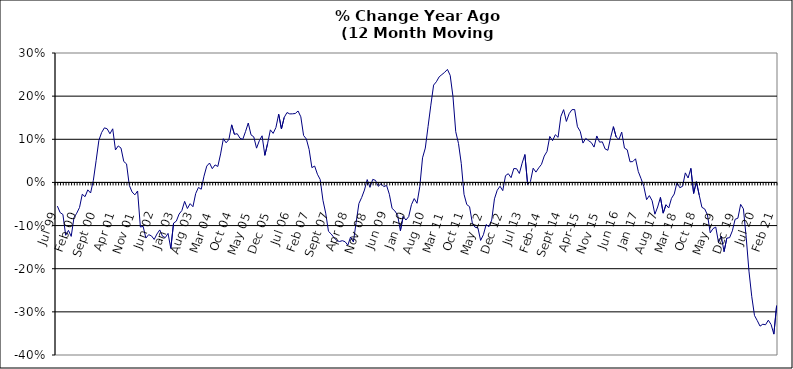
| Category | Series 0 |
|---|---|
| Jul 99 | -0.055 |
| Aug 99 | -0.07 |
| Sep 99 | -0.074 |
| Oct 99 | -0.123 |
| Nov 99 | -0.111 |
| Dec 99 | -0.125 |
| Jan 00 | -0.082 |
| Feb 00 | -0.071 |
| Mar 00 | -0.058 |
| Apr 00 | -0.027 |
| May 00 | -0.033 |
| Jun 00 | -0.017 |
| Jul 00 | -0.025 |
| Aug 00 | 0.005 |
| Sep 00 | 0.05 |
| Oct 00 | 0.098 |
| Nov 00 | 0.116 |
| Dec 00 | 0.127 |
| Jan 01 | 0.124 |
| Feb 01 | 0.113 |
| Mar 01 | 0.124 |
| Apr 01 | 0.075 |
| May 01 | 0.085 |
| Jun 01 | 0.08 |
| Jul 01 | 0.048 |
| Aug 01 | 0.043 |
| Sep 01 | -0.007 |
| Oct 01 | -0.022 |
| Nov 01 | -0.029 |
| Dec 01 | -0.02 |
| Jan 02 | -0.103 |
| Feb 02 | -0.102 |
| Mar 02 | -0.129 |
| Apr 02 | -0.121 |
| May 02 | -0.124 |
| Jun 02 | -0.132 |
| Jul 02 | -0.119 |
| Aug 02 | -0.11 |
| Sep 02 | -0.125 |
| Oct 02 | -0.128 |
| Nov 02 | -0.118 |
| Dec 02 | -0.153 |
| Jan 03 | -0.094 |
| Feb 03 | -0.09 |
| Mar 03 | -0.073 |
| Apr 03 | -0.065 |
| May 03 | -0.044 |
| Jun 03 | -0.06 |
| Jul 03 | -0.049 |
| Aug 03 | -0.056 |
| Sep 03 | -0.026 |
| Oct 03 | -0.012 |
| Nov 03 | -0.016 |
| Dec 03 | 0.014 |
| Jan 04 | 0.038 |
| Feb 04 | 0.045 |
| Mar 04 | 0.032 |
| Apr 04 | 0.041 |
| May 04 | 0.037 |
| Jun 04 | 0.066 |
| Jul 04 | 0.101 |
| Aug 04 | 0.092 |
| Sep 04 | 0.1 |
| Oct 04 | 0.133 |
| Nov 04 | 0.111 |
| Dec 04 | 0.113 |
| Jan 05 | 0.103 |
| Feb 05 | 0.1 |
| Mar 05 | 0.118 |
| Apr 05 | 0.138 |
| May 05 | 0.11 |
| Jun 05 | 0.106 |
| Jul 05 | 0.079 |
| Aug 05 | 0.097 |
| Sep 05 | 0.108 |
| Oct 05 | 0.063 |
| Nov 05 | 0.09 |
| Dec 05 | 0.122 |
| Jan 06 | 0.114 |
| Feb 06 | 0.127 |
| Mar 06 | 0.158 |
| Apr 06 | 0.124 |
| May 06 | 0.151 |
| Jun 06 | 0.162 |
| Jul 06 | 0.159 |
| Aug 06 | 0.159 |
| Sep 06 | 0.16 |
| Oct 06 | 0.166 |
| Nov 06 | 0.152 |
| Dec 06 | 0.109 |
| Jan 07 | 0.101 |
| Feb 07 | 0.076 |
| Mar 07 | 0.034 |
| Apr 07 | 0.038 |
| May 07 | 0.019 |
| Jun 07 | 0.007 |
| Jul 07 | -0.041 |
| Aug 07 | -0.071 |
| Sep 07 | -0.113 |
| Oct 07 | -0.12 |
| Nov 07 | -0.128 |
| Dec 07 | -0.135 |
| Jan 08 | -0.137 |
| Feb 08 | -0.135 |
| Mar 08 | -0.137 |
| Apr 08 | -0.145 |
| May 08 | -0.126 |
| Jun 08 | -0.138 |
| Jul 08 | -0.093 |
| Aug 08 | -0.049 |
| Sep-08 | -0.035 |
| Oct 08 | -0.018 |
| Nov 08 | 0.007 |
| Dec 08 | -0.011 |
| Jan 09 | 0.007 |
| Feb 09 | 0.005 |
| Mar 09 | -0.009 |
| Apr 09 | -0.003 |
| May 09 | -0.01 |
| Jun 09 | -0.007 |
| Jul 09 | -0.027 |
| Aug 09 | -0.06 |
| Sep 09 | -0.066 |
| Oct 09 | -0.076 |
| Nov 09 | -0.112 |
| Dec 09 | -0.079 |
| Jan 10 | -0.087 |
| Feb 10 | -0.079 |
| Mar 10 | -0.052 |
| Apr 10 | -0.037 |
| May 10 | -0.048 |
| Jun 10 | -0.01 |
| Jul 10 | 0.057 |
| Aug 10 | 0.08 |
| Sep 10 | 0.13 |
| Oct 10 | 0.179 |
| Nov 10 | 0.226 |
| Dec 10 | 0.233 |
| Jan 11 | 0.245 |
| Feb 11 | 0.25 |
| Mar 11 | 0.255 |
| Apr 11 | 0.262 |
| May 11 | 0.248 |
| Jun 11 | 0.199 |
| Jul 11 | 0.118 |
| Aug 11 | 0.09 |
| Sep 11 | 0.044 |
| Oct 11 | -0.028 |
| Nov 11 | -0.051 |
| Dec 11 | -0.056 |
| Jan 12 | -0.094 |
| Feb 12 | -0.104 |
| Mar 12 | -0.105 |
| Apr 12 | -0.134 |
| May 12 | -0.121 |
| Jun 12 | -0.098 |
| Jul 12 | -0.103 |
| Aug 12 | -0.087 |
| Sep 12 | -0.038 |
| Oct 12 | -0.018 |
| Nov 12 | -0.009 |
| Dec 12 | -0.019 |
| Jan 13 | 0.016 |
| Feb-13 | 0.02 |
| Mar-13 | 0.011 |
| Apr 13 | 0.032 |
| May 13 | 0.032 |
| Jun-13 | 0.021 |
| Jul 13 | 0.045 |
| Aug 13 | 0.065 |
| Sep 13 | -0.005 |
| Oct 13 | 0.002 |
| Nov 13 | 0.033 |
| Dec 13 | 0.024 |
| Jan 14 | 0.034 |
| Feb-14 | 0.042 |
| Mar 14 | 0.061 |
| Apr 14 | 0.072 |
| May 14 | 0.107 |
| Jun 14 | 0.097 |
| Jul-14 | 0.111 |
| Aug-14 | 0.105 |
| Sep 14 | 0.153 |
| Oct 14 | 0.169 |
| Nov 14 | 0.141 |
| Dec 14 | 0.159 |
| Jan 15 | 0.169 |
| Feb 15 | 0.169 |
| Mar 15 | 0.129 |
| Apr-15 | 0.118 |
| May 15 | 0.091 |
| Jun-15 | 0.102 |
| Jul 15 | 0.097 |
| Aug 15 | 0.092 |
| Sep 15 | 0.082 |
| Oct 15 | 0.108 |
| Nov 15 | 0.093 |
| Dec 15 | 0.094 |
| Jan 16 | 0.078 |
| Feb 16 | 0.075 |
| Mar 16 | 0.104 |
| Apr 16 | 0.129 |
| May 16 | 0.105 |
| Jun 16 | 0.1 |
| Jul 16 | 0.117 |
| Aug 16 | 0.08 |
| Sep 16 | 0.076 |
| Oct 16 | 0.048 |
| Nov 16 | 0.048 |
| Dec 16 | 0.055 |
| Jan 17 | 0.025 |
| Feb 17 | 0.009 |
| Mar 17 | -0.01 |
| Apr 17 | -0.04 |
| May 17 | -0.031 |
| Jun 17 | -0.042 |
| Jul 17 | -0.074 |
| Aug 17 | -0.057 |
| Sep 17 | -0.035 |
| Oct 17 | -0.071 |
| Nov 17 | -0.052 |
| Dec 17 | -0.059 |
| Jan 18 | -0.037 |
| Feb 18 | -0.027 |
| Mar 18 | 0 |
| Apr 18 | -0.012 |
| May 18 | -0.009 |
| Jun 18 | 0.022 |
| Jul 18 | 0.01 |
| Aug 18 | 0.033 |
| Sep 18 | -0.025 |
| Oct 18 | 0.002 |
| Nov 18 | -0.029 |
| Dec 18 | -0.058 |
| Jan 19 | -0.061 |
| Feb 19 | -0.075 |
| Mar 19 | -0.117 |
| Apr 19 | -0.107 |
| May 19 | -0.104 |
| Jun 19 | -0.139 |
| Jul 19 | -0.124 |
| Aug 19 | -0.16 |
| Sep 19 | -0.129 |
| Oct 19 | -0.128 |
| Nov 19 | -0.112 |
| Dec 19 | -0.085 |
| Jan 20 | -0.083 |
| Feb 20 | -0.051 |
| Mar 20 | -0.061 |
| Apr 20 | -0.127 |
| May 20 | -0.206 |
| Jun 20 | -0.264 |
| Jul 20 | -0.308 |
| Aug 20 | -0.32 |
| Sep 20 | -0.333 |
| Oct 20 | -0.329 |
| Nov 20 | -0.33 |
| Dec 20 | -0.319 |
| Jan 21 | -0.329 |
| Feb 21 | -0.352 |
| Mar 21 | -0.286 |